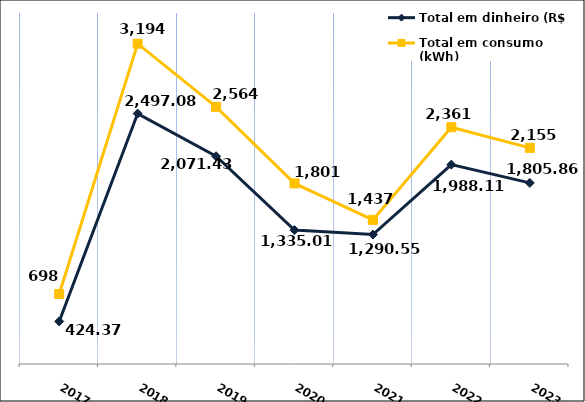
| Category | Total em dinheiro (R$) |
|---|---|
| 2017.0 | 424.37 |
| 2018.0 | 2497.08 |
| 2019.0 | 2071.43 |
| 2020.0 | 1335.01 |
| 2021.0 | 1290.55 |
| 2022.0 | 1988.11 |
| 2023.0 | 1805.86 |